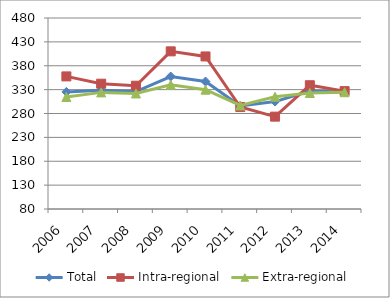
| Category | Total | Intra-regional | Extra-regional |
|---|---|---|---|
| 2006.0 | 325.206 | 357.695 | 314.612 |
| 2007.0 | 328.688 | 342.408 | 324.215 |
| 2008.0 | 325.965 | 338.189 | 321.978 |
| 2009.0 | 357.423 | 410.161 | 340.225 |
| 2010.0 | 346.978 | 399.483 | 329.857 |
| 2011.0 | 295.98 | 293.475 | 296.796 |
| 2012.0 | 304.953 | 273.422 | 315.235 |
| 2013.0 | 326.987 | 339.225 | 322.997 |
| 2014.0 | 325.129 | 326.882 | 324.558 |